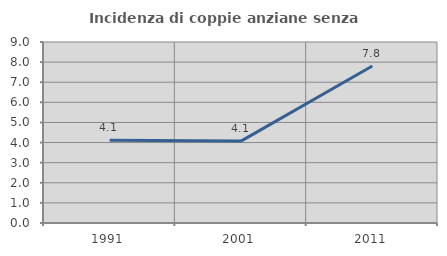
| Category | Incidenza di coppie anziane senza figli  |
|---|---|
| 1991.0 | 4.118 |
| 2001.0 | 4.071 |
| 2011.0 | 7.806 |